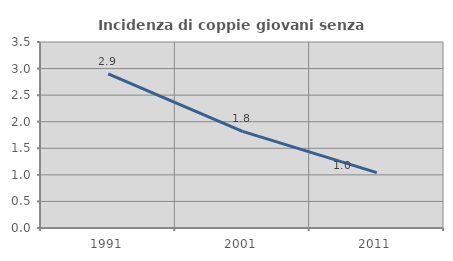
| Category | Incidenza di coppie giovani senza figli |
|---|---|
| 1991.0 | 2.899 |
| 2001.0 | 1.818 |
| 2011.0 | 1.042 |